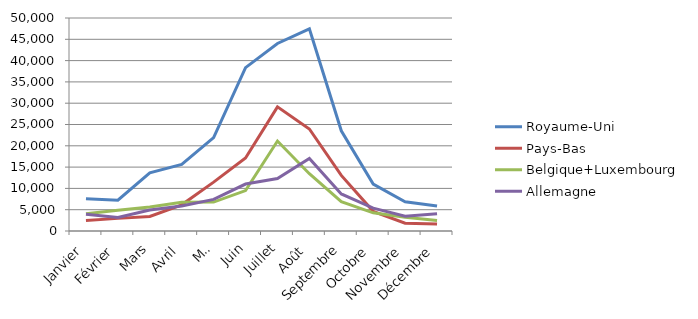
| Category | Royaume-Uni | Pays-Bas | Belgique+Luxembourg | Allemagne |
|---|---|---|---|---|
| Janvier | 7572 | 2437 | 4062 | 3924 |
| Février | 7231 | 2964 | 4865 | 3172 |
| Mars | 13671 | 3414 | 5637 | 4907 |
| Avril | 15630 | 6142 | 6724 | 5869 |
| Mai | 21912 | 11477 | 6783 | 7419 |
| Juin | 38345 | 17133 | 9478 | 11021 |
| Juillet | 44012 | 29147 | 21113 | 12304 |
| Août | 47446 | 23943 | 13443 | 17031 |
| Septembre | 23522 | 13048 | 6879 | 8698 |
| Octobre | 11004 | 4612 | 4258 | 5364 |
| Novembre | 6877 | 1827 | 3250 | 3462 |
| Décembre | 5883 | 1633 | 2475 | 4056 |